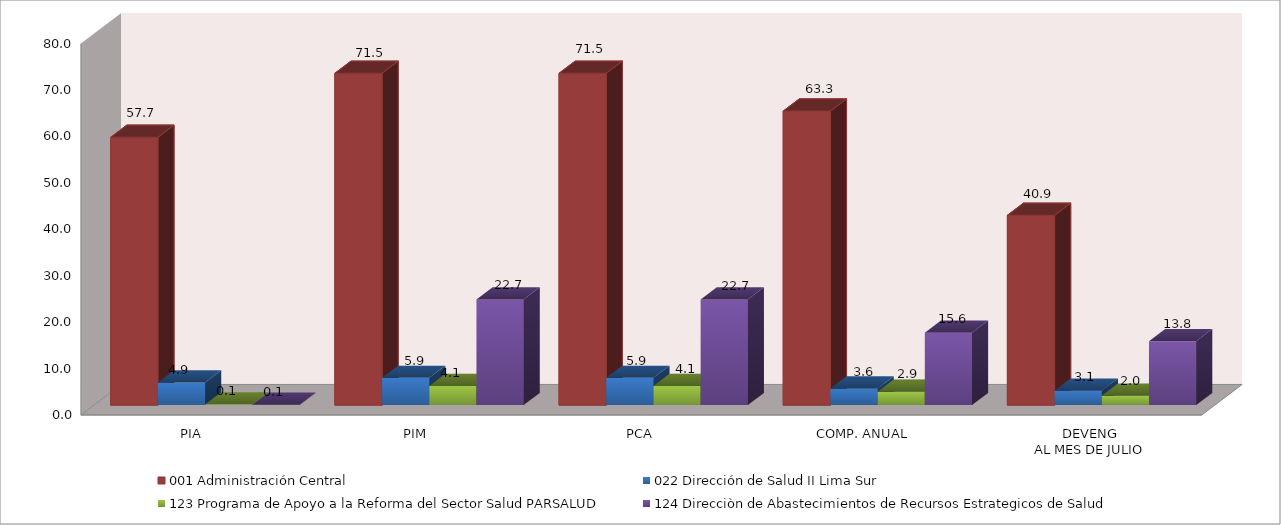
| Category | 001 Administración Central | 022 Dirección de Salud II Lima Sur | 123 Programa de Apoyo a la Reforma del Sector Salud PARSALUD | 124 Direcciòn de Abastecimientos de Recursos Estrategicos de Salud |
|---|---|---|---|---|
| PIA | 57.681 | 4.868 | 0.136 | 0.1 |
| PIM | 71.464 | 5.868 | 4.136 | 22.726 |
| PCA | 71.464 | 5.868 | 4.136 | 22.726 |
| COMP. ANUAL | 63.331 | 3.569 | 2.875 | 15.593 |
| DEVENG
AL MES DE JULIO | 40.882 | 3.114 | 2.027 | 13.765 |